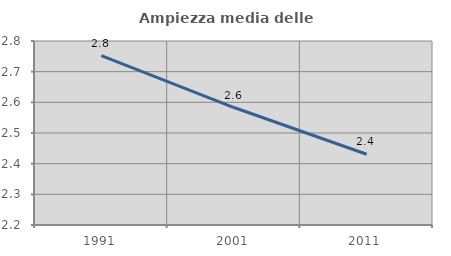
| Category | Ampiezza media delle famiglie |
|---|---|
| 1991.0 | 2.752 |
| 2001.0 | 2.583 |
| 2011.0 | 2.431 |